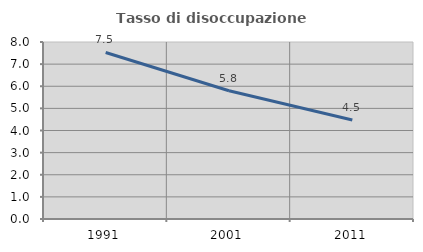
| Category | Tasso di disoccupazione giovanile  |
|---|---|
| 1991.0 | 7.527 |
| 2001.0 | 5.797 |
| 2011.0 | 4.478 |